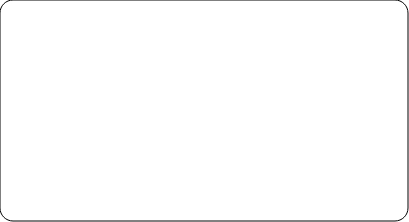
| Category | Series 0 |
|---|---|
| Soins | 0 |
| Administrative | 0 |
| Hébergement | 0 |